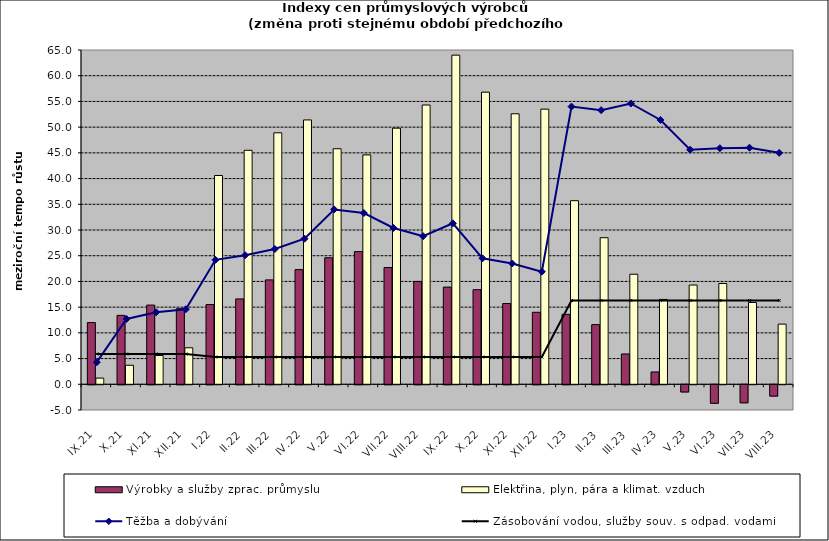
| Category | Výrobky a služby zprac. průmyslu | Elektřina, plyn, pára a klimat. vzduch |
|---|---|---|
| IX.21 | 12 | 1.2 |
| X.21 | 13.4 | 3.7 |
| XI.21 | 15.4 | 5.6 |
| XII.21 | 14.7 | 7.1 |
| I.22 | 15.5 | 40.6 |
| II.22 | 16.6 | 45.5 |
| III.22 | 20.3 | 48.9 |
| IV.22 | 22.3 | 51.4 |
| V.22 | 24.6 | 45.8 |
| VI.22 | 25.8 | 44.6 |
| VII.22 | 22.7 | 49.8 |
| VIII.22 | 20 | 54.3 |
| IX.22 | 18.9 | 64 |
| X.22 | 18.4 | 56.8 |
| XI.22 | 15.7 | 52.6 |
| XII.22 | 14 | 53.5 |
| I.23 | 13.6 | 35.7 |
| II.23 | 11.6 | 28.5 |
| III.23 | 5.9 | 21.4 |
| IV.23 | 2.4 | 16.5 |
| V.23 | -1.4 | 19.3 |
| VI.23 | -3.6 | 19.6 |
| VII.23 | -3.5 | 15.9 |
| VIII.23 | -2.2 | 11.7 |